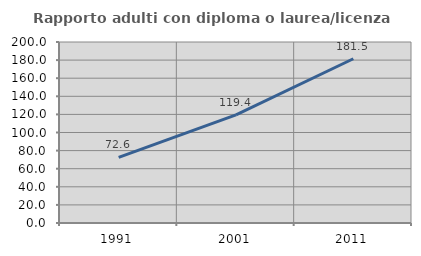
| Category | Rapporto adulti con diploma o laurea/licenza media  |
|---|---|
| 1991.0 | 72.552 |
| 2001.0 | 119.395 |
| 2011.0 | 181.468 |